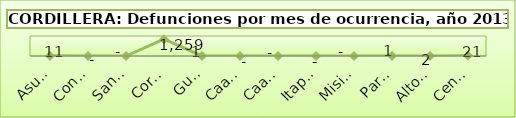
| Category | DEFUNCIÓN |
|---|---|
| Asunción | 11 |
| Concepción | 0 |
| San Pedro | 0 |
| Cordillera | 1259 |
| Guairá | 1 |
| Caaguazú | 0 |
| Caazapá | 0 |
| Itapúa | 0 |
| Misiones | 0 |
| Paraguarí | 1 |
| Alto Paraná | 2 |
| Central | 21 |